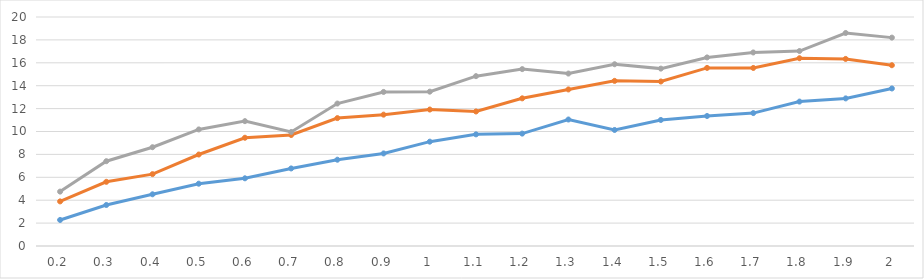
| Category | 10 | 25 | 50 |
|---|---|---|---|
| 0.2 | 2.274 | 3.896 | 4.75 |
| 0.3 | 3.582 | 5.606 | 7.407 |
| 0.4 | 4.516 | 6.277 | 8.628 |
| 0.5 | 5.441 | 7.99 | 10.18 |
| 0.6 | 5.913 | 9.455 | 10.904 |
| 0.7 | 6.774 | 9.693 | 9.958 |
| 0.8 | 7.536 | 11.17 | 12.441 |
| 0.9 | 8.084 | 11.471 | 13.454 |
| 1.0 | 9.112 | 11.918 | 13.479 |
| 1.1 | 9.75 | 11.749 | 14.835 |
| 1.2 | 9.817 | 12.897 | 15.448 |
| 1.3 | 11.047 | 13.674 | 15.06 |
| 1.4 | 10.133 | 14.422 | 15.875 |
| 1.5 | 11.008 | 14.367 | 15.493 |
| 1.6 | 11.354 | 15.554 | 16.47 |
| 1.7 | 11.608 | 15.55 | 16.903 |
| 1.8 | 12.612 | 16.399 | 17.028 |
| 1.9 | 12.891 | 16.338 | 18.604 |
| 2.0 | 13.758 | 15.788 | 18.199 |